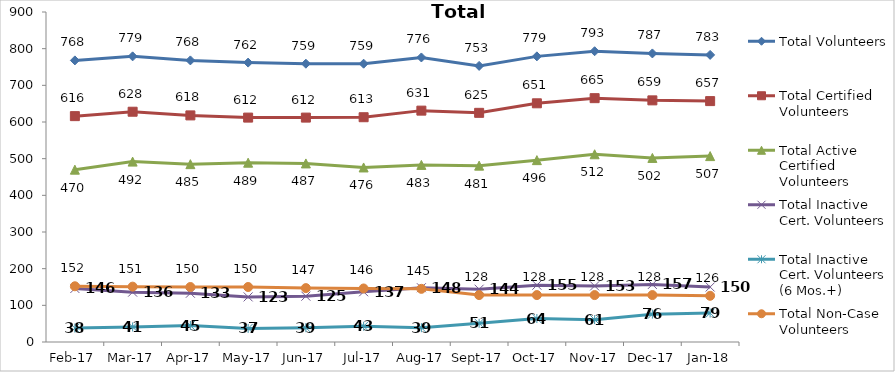
| Category | Total Volunteers | Total Certified Volunteers | Total Active Certified Volunteers | Total Inactive Cert. Volunteers | Total Inactive Cert. Volunteers (6 Mos.+) | Total Non-Case Volunteers |
|---|---|---|---|---|---|---|
| 2017-02-01 | 768 | 616 | 470 | 146 | 38 | 152 |
| 2017-03-01 | 779 | 628 | 492 | 136 | 41 | 151 |
| 2017-04-01 | 768 | 618 | 485 | 133 | 45 | 150 |
| 2017-05-01 | 762 | 612 | 489 | 123 | 37 | 150 |
| 2017-06-01 | 759 | 612 | 487 | 125 | 39 | 147 |
| 2017-07-01 | 759 | 613 | 476 | 137 | 43 | 146 |
| 2017-08-01 | 776 | 631 | 483 | 148 | 39 | 145 |
| 2017-09-01 | 753 | 625 | 481 | 144 | 51 | 128 |
| 2017-10-01 | 779 | 651 | 496 | 155 | 64 | 128 |
| 2017-11-01 | 793 | 665 | 512 | 153 | 61 | 128 |
| 2017-12-01 | 787 | 659 | 502 | 157 | 76 | 128 |
| 2018-01-01 | 783 | 657 | 507 | 150 | 79 | 126 |